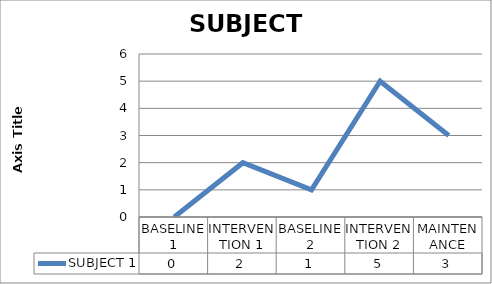
| Category | SUBJECT 1 |
|---|---|
| BASELINE 1 | 0 |
| INTERVENTION 1 | 2 |
| BASELINE 2 | 1 |
| INTERVENTION 2 | 5 |
| MAINTENANCE | 3 |